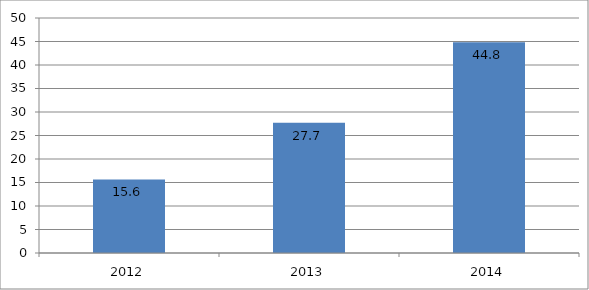
| Category | Nigeria |
|---|---|
| 2012.0 | 15.647 |
| 2013.0 | 27.736 |
| 2014.0 | 44.827 |